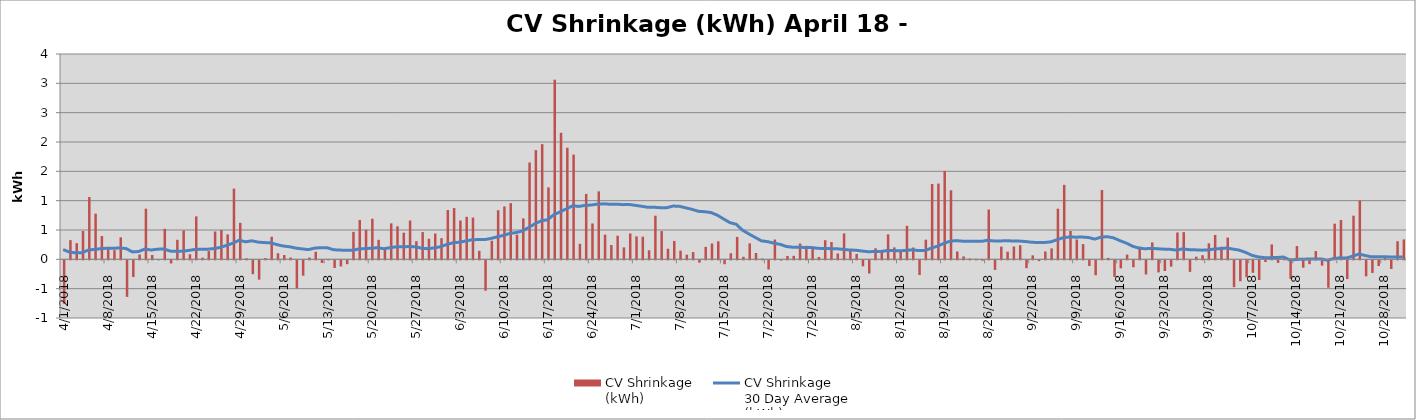
| Category | CV Shrinkage
(kWh) |
|---|---|
| 4/1/18 | -738624 |
| 4/2/18 | 327398 |
| 4/3/18 | 275905 |
| 4/4/18 | 483044 |
| 4/5/18 | 1061787 |
| 4/6/18 | 778778 |
| 4/7/18 | 397072 |
| 4/8/18 | 209880 |
| 4/9/18 | 157006 |
| 4/10/18 | 374594 |
| 4/11/18 | -622327 |
| 4/12/18 | -285900 |
| 4/13/18 | 82775 |
| 4/14/18 | 862938 |
| 4/15/18 | 74009 |
| 4/16/18 | 5038 |
| 4/17/18 | 521427 |
| 4/18/18 | -53796 |
| 4/19/18 | 332758 |
| 4/20/18 | 493042 |
| 4/21/18 | 86841 |
| 4/22/18 | 732288 |
| 4/23/18 | 28193 |
| 4/24/18 | 140202 |
| 4/25/18 | 474373 |
| 4/26/18 | 500354 |
| 4/27/18 | 425305 |
| 4/28/18 | 1205024 |
| 4/29/18 | 621369 |
| 4/30/18 | 17919 |
| 5/1/18 | -236377 |
| 5/2/18 | -328942 |
| 5/3/18 | 21756 |
| 5/4/18 | 385441 |
| 5/5/18 | 103540 |
| 5/6/18 | 73454 |
| 5/7/18 | 30705 |
| 5/8/18 | -478550 |
| 5/9/18 | -262385 |
| 5/10/18 | 30476 |
| 5/11/18 | 129299 |
| 5/12/18 | -45274 |
| 5/13/18 | 3598 |
| 5/14/18 | -129751 |
| 5/15/18 | -104212 |
| 5/16/18 | -65912 |
| 5/17/18 | 467987 |
| 5/18/18 | 671040 |
| 5/19/18 | 504429 |
| 5/20/18 | 691920 |
| 5/21/18 | 332104 |
| 5/22/18 | 197358 |
| 5/23/18 | 612924 |
| 5/24/18 | 563123 |
| 5/25/18 | 453831 |
| 5/26/18 | 661923 |
| 5/27/18 | 309941 |
| 5/28/18 | 464684 |
| 5/29/18 | 350622 |
| 5/30/18 | 439959 |
| 5/31/18 | 360994 |
| 6/1/18 | 840937 |
| 6/2/18 | 873832 |
| 6/3/18 | 662326 |
| 6/4/18 | 724701 |
| 6/5/18 | 711959 |
| 6/6/18 | 145761 |
| 6/7/18 | -517452 |
| 6/8/18 | 317686 |
| 6/9/18 | 836629 |
| 6/10/18 | 901414 |
| 6/11/18 | 958595 |
| 6/12/18 | 420055 |
| 6/13/18 | 698009 |
| 6/14/18 | 1651359 |
| 6/15/18 | 1861656 |
| 6/16/18 | 1963904 |
| 6/17/18 | 1226810 |
| 6/18/18 | 3062184 |
| 6/19/18 | 2156930 |
| 6/20/18 | 1902489 |
| 6/21/18 | 1785249 |
| 6/22/18 | 264963 |
| 6/23/18 | 1115444 |
| 6/24/18 | 611814 |
| 6/25/18 | 1158590 |
| 6/26/18 | 420023 |
| 6/27/18 | 244432 |
| 6/28/18 | 402134 |
| 6/29/18 | 203984 |
| 6/30/18 | 441420 |
| 7/1/18 | 391104 |
| 7/2/18 | 386340 |
| 7/3/18 | 154873 |
| 7/4/18 | 744443 |
| 7/5/18 | 481865 |
| 7/6/18 | 180750 |
| 7/7/18 | 313233 |
| 7/8/18 | 148220 |
| 7/9/18 | 79101 |
| 7/10/18 | 123342 |
| 7/11/18 | -40028 |
| 7/12/18 | 211682 |
| 7/13/18 | 269971 |
| 7/14/18 | 307261 |
| 7/15/18 | -66606 |
| 7/16/18 | 103603 |
| 7/17/18 | 382337 |
| 7/18/18 | 43512 |
| 7/19/18 | 272191 |
| 7/20/18 | 107558 |
| 7/21/18 | 12085 |
| 7/22/18 | -155908 |
| 7/23/18 | 337358 |
| 7/24/18 | -4176 |
| 7/25/18 | 56800 |
| 7/26/18 | 59689 |
| 7/27/18 | 269942 |
| 7/28/18 | 229305 |
| 7/29/18 | 176821 |
| 7/30/18 | 40046 |
| 7/31/18 | 326197 |
| 8/1/18 | 295806 |
| 8/2/18 | 100952 |
| 8/3/18 | 441545 |
| 8/4/18 | 140363 |
| 8/5/18 | 91986 |
| 8/6/18 | -101728 |
| 8/7/18 | -224268 |
| 8/8/18 | 188706 |
| 8/9/18 | 134310 |
| 8/10/18 | 424861 |
| 8/11/18 | 203824 |
| 8/12/18 | 129710 |
| 8/13/18 | 572088 |
| 8/14/18 | 201122 |
| 8/15/18 | -250139 |
| 8/16/18 | 334679 |
| 8/17/18 | 1283974 |
| 8/18/18 | 1291283 |
| 8/19/18 | 1507228 |
| 8/20/18 | 1176966 |
| 8/21/18 | 134150 |
| 8/22/18 | 49897 |
| 8/23/18 | 14209 |
| 8/24/18 | 9234 |
| 8/25/18 | -7150 |
| 8/26/18 | 848840 |
| 8/27/18 | -163165 |
| 8/28/18 | 216774 |
| 8/29/18 | 130374 |
| 8/30/18 | 218838 |
| 8/31/18 | 240514 |
| 9/1/18 | -133110 |
| 9/2/18 | 67399 |
| 9/3/18 | -14203 |
| 9/4/18 | 133911 |
| 9/5/18 | 186571 |
| 9/6/18 | 862590 |
| 9/7/18 | 1269880 |
| 9/8/18 | 483732 |
| 9/9/18 | 337976 |
| 9/10/18 | 259474 |
| 9/11/18 | -96387 |
| 9/12/18 | -254560 |
| 9/13/18 | 1180955 |
| 9/14/18 | 24479 |
| 9/15/18 | -282685 |
| 9/16/18 | -137333 |
| 9/17/18 | 81234 |
| 9/18/18 | -118221 |
| 9/19/18 | 216348 |
| 9/20/18 | -241002 |
| 9/21/18 | 288463 |
| 9/22/18 | -205692 |
| 9/23/18 | -181987 |
| 9/24/18 | -107507 |
| 9/25/18 | 457747 |
| 9/26/18 | 463636 |
| 9/27/18 | -196796 |
| 9/28/18 | 45502 |
| 9/29/18 | 70505 |
| 9/30/18 | 273197 |
| 10/1/18 | 415397 |
| 10/2/18 | 216198 |
| 10/3/18 | 370783 |
| 10/4/18 | -457516 |
| 10/5/18 | -357033 |
| 10/6/18 | -287787 |
| 10/7/18 | -212845 |
| 10/8/18 | -336077 |
| 10/9/18 | -29195 |
| 10/10/18 | 254191 |
| 10/11/18 | -43119 |
| 10/12/18 | 37078 |
| 10/13/18 | -316371 |
| 10/14/18 | 227043 |
| 10/15/18 | -126396 |
| 10/16/18 | -65494 |
| 10/17/18 | 140825 |
| 10/18/18 | -90894 |
| 10/19/18 | -467440 |
| 10/20/18 | 607877 |
| 10/21/18 | 669902 |
| 10/22/18 | -319394 |
| 10/23/18 | 743968 |
| 10/24/18 | 1002436 |
| 10/25/18 | -272970 |
| 10/26/18 | -214446 |
| 10/27/18 | -97246 |
| 10/28/18 | 38780 |
| 10/29/18 | -147842 |
| 10/30/18 | 309635 |
| 10/31/18 | 339786 |